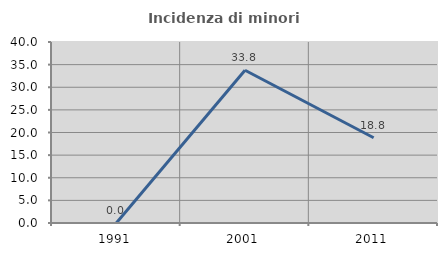
| Category | Incidenza di minori stranieri |
|---|---|
| 1991.0 | 0 |
| 2001.0 | 33.766 |
| 2011.0 | 18.841 |